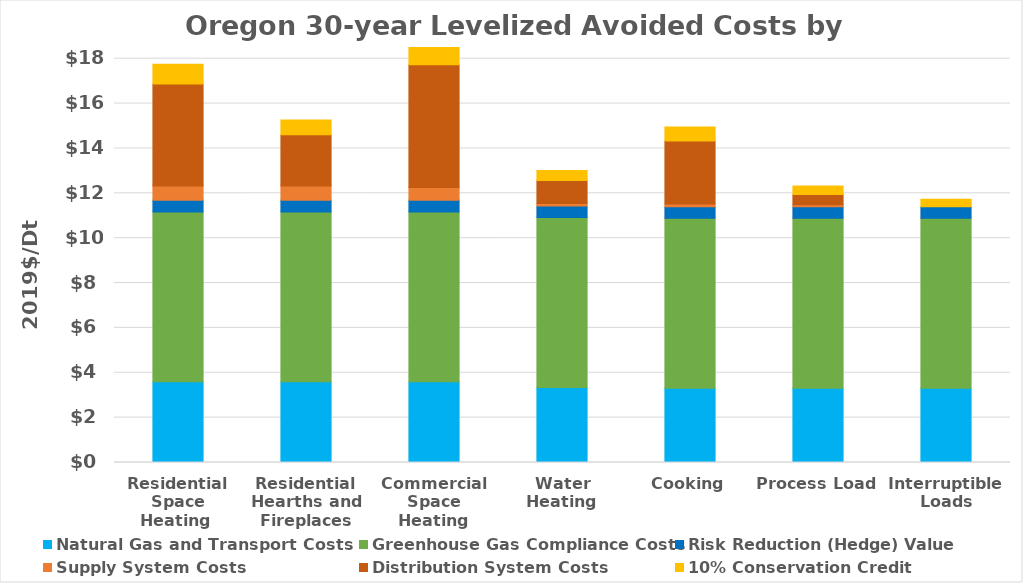
| Category | Natural Gas and Transport Costs | Greenhouse Gas Compliance Costs | Risk Reduction (Hedge) Value | Supply System Costs | Distribution System Costs | 10% Conservation Credit |
|---|---|---|---|---|---|---|
| Residential Space Heating  | 3.597 | 7.569 | 0.52 | 0.644 | 4.539 | 0.878 |
| Residential Hearths and Fireplaces | 3.597 | 7.569 | 0.52 | 0.644 | 2.285 | 0.653 |
| Commercial Space Heating | 3.597 | 7.569 | 0.52 | 0.575 | 5.474 | 0.965 |
| Water Heating | 3.347 | 7.569 | 0.52 | 0.107 | 1.026 | 0.448 |
| Cooking | 3.314 | 7.569 | 0.52 | 0.116 | 2.813 | 0.624 |
| Process Load | 3.314 | 7.569 | 0.52 | 0.089 | 0.451 | 0.385 |
| Interruptible Loads | 3.314 | 7.569 | 0.52 | 0 | 0 | 0.331 |